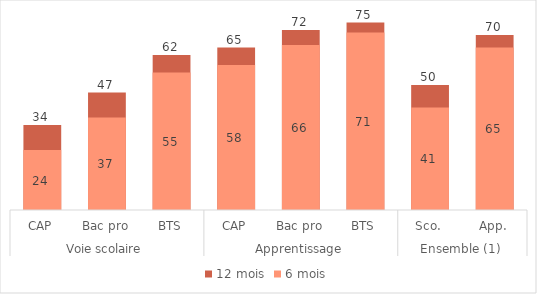
| Category | 12 mois | 6 mois |
|---|---|---|
| 0 | 34 | 24 |
| 1 | 47 | 37 |
| 2 | 62 | 55 |
| 3 | 65 | 58 |
| 4 | 72 | 66 |
| 5 | 75 | 71 |
| 6 | 50 | 41 |
| 7 | 70 | 65 |